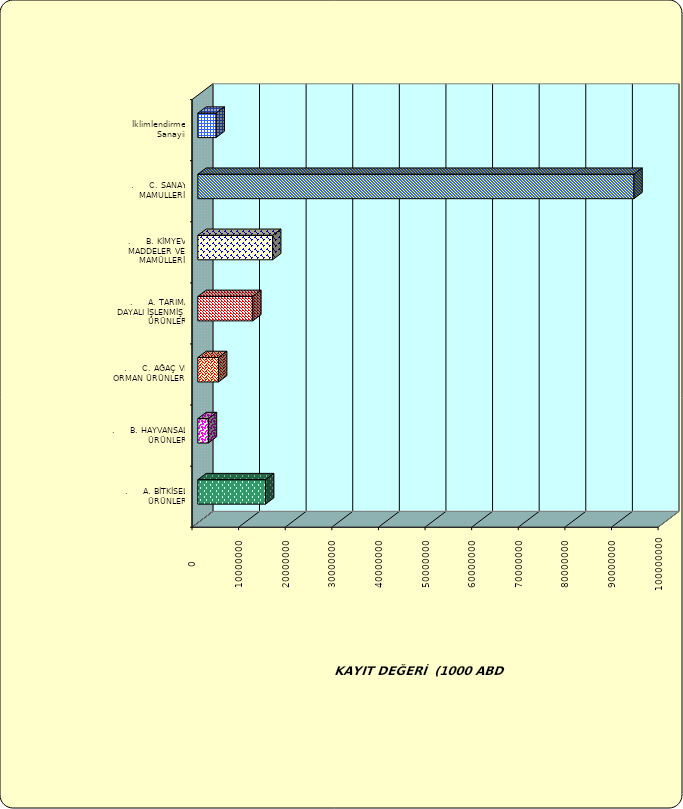
| Category | Series 0 |
|---|---|
| .     A. BİTKİSEL ÜRÜNLER | 14527697.561 |
| .     B. HAYVANSAL ÜRÜNLER | 2260996.231 |
| .     C. AĞAÇ VE ORMAN ÜRÜNLERİ | 4446395.621 |
| .     A. TARIMA DAYALI İŞLENMİŞ ÜRÜNLER | 11786741.219 |
| .     B. KİMYEVİ MADDELER VE MAMÜLLERİ | 16042218.116 |
| .     C. SANAYİ MAMULLERİ | 93563813.358 |
|  İklimlendirme Sanayii | 3921347.704 |